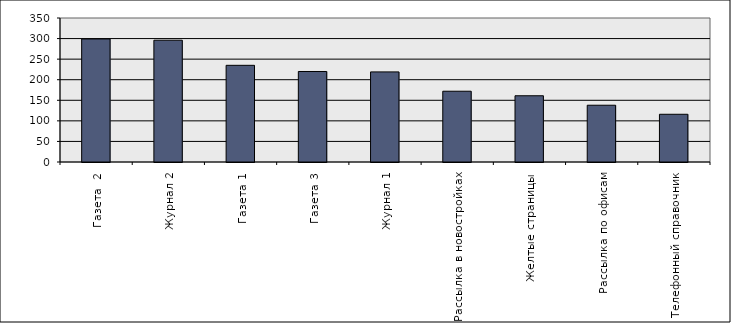
| Category | Series 0 |
|---|---|
| Газета  2 | 299 |
| Журнал 2 | 296 |
| Газета 1 | 235 |
| Газета 3 | 220 |
| Журнал 1 | 219 |
| Рассылка в новостройках | 172 |
| Желтые страницы | 161 |
| Рассылка по офисам | 138 |
| Телефонный справочник | 116 |